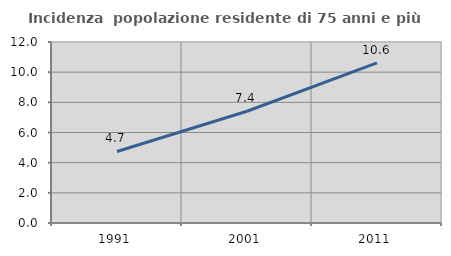
| Category | Incidenza  popolazione residente di 75 anni e più |
|---|---|
| 1991.0 | 4.743 |
| 2001.0 | 7.409 |
| 2011.0 | 10.615 |